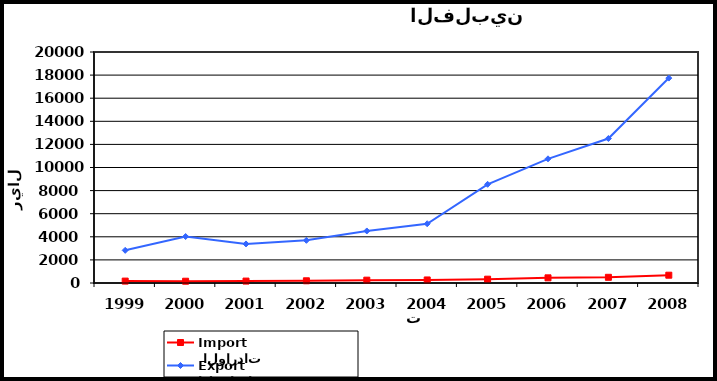
| Category |  الواردات           Import | الصادرات          Export |
|---|---|---|
| 1999.0 | 165 | 2828 |
| 2000.0 | 153 | 4023 |
| 2001.0 | 166 | 3382 |
| 2002.0 | 192 | 3694 |
| 2003.0 | 245 | 4505 |
| 2004.0 | 263 | 5130 |
| 2005.0 | 331 | 8544 |
| 2006.0 | 447 | 10751 |
| 2007.0 | 493 | 12510 |
| 2008.0 | 676 | 17742 |